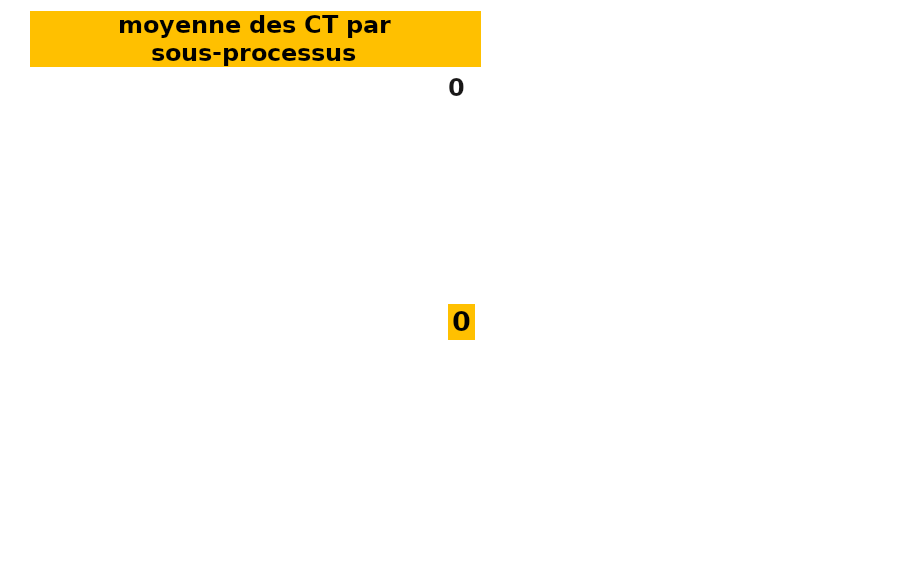
| Category | CT | Series 1 | Series 2 | Series 3 |
|---|---|---|---|---|
| 0.0 | 0 | 6 | 13 | 25 |